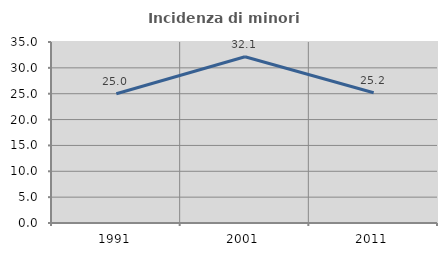
| Category | Incidenza di minori stranieri |
|---|---|
| 1991.0 | 25 |
| 2001.0 | 32.143 |
| 2011.0 | 25.199 |